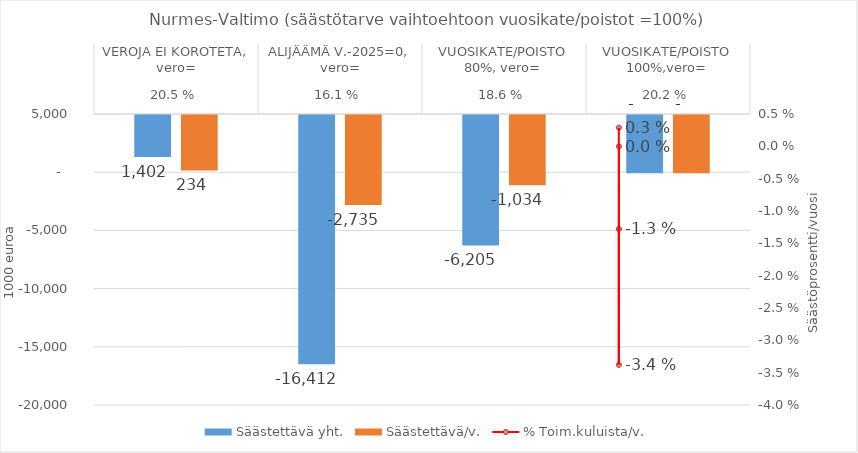
| Category | Säästettävä yht. | Säästettävä/v. |
|---|---|---|
| 0 | 1401.697 | 233.616 |
| 1 | -16412.111 | -2735.352 |
| 2 | -6205.143 | -1034.19 |
| 3 | 0 | 0 |